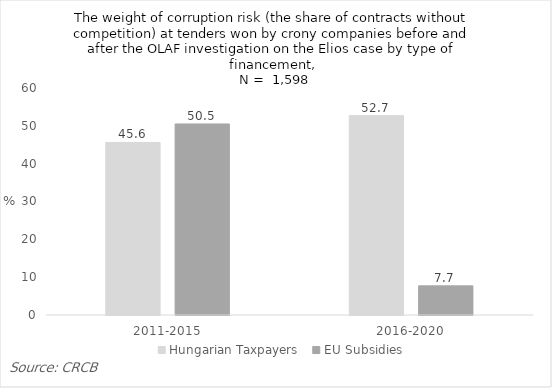
| Category | Hungarian Taxpayers | EU Subsidies |
|---|---|---|
| 2011-2015 | 45.6 | 50.5 |
| 2016-2020 | 52.7 | 7.7 |